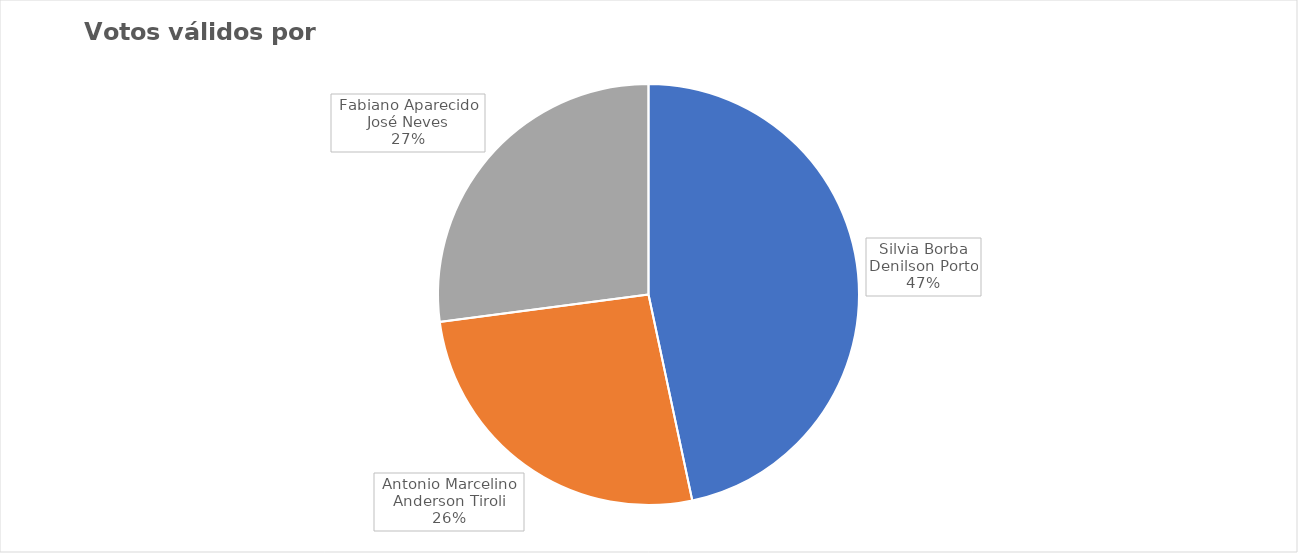
| Category | Votos válidos por chapa |
|---|---|
| Silvia Borba
Denilson Porto | 336 |
| Antonio Marcelino
Anderson Tiroli | 189 |
| Fabiano Aparecido
José Neves | 195 |